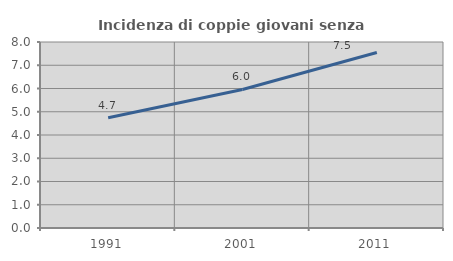
| Category | Incidenza di coppie giovani senza figli |
|---|---|
| 1991.0 | 4.741 |
| 2001.0 | 5.957 |
| 2011.0 | 7.547 |